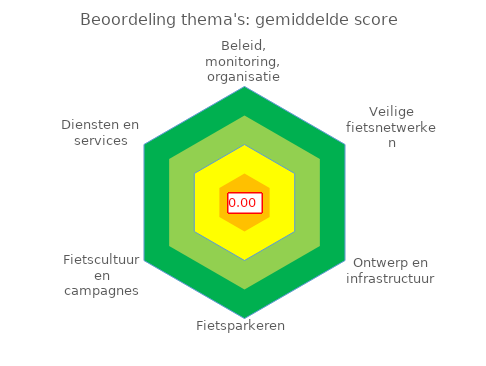
| Category | 4 | 3 | 2 | 1 | Gemiddelde score |
|---|---|---|---|---|---|
| Beleid, monitoring, organisatie | 4 | 3 | 2 | 1 | 0 |
| Veilige fietsnetwerken | 4 | 3 | 2 | 1 | 0 |
| Ontwerp en infrastructuur | 4 | 3 | 2 | 1 | 0 |
| Fietsparkeren | 4 | 3 | 2 | 1 | 0 |
| Fietscultuur en campagnes | 4 | 3 | 2 | 1 | 0 |
| Diensten en services | 4 | 3 | 2 | 1 | 0 |